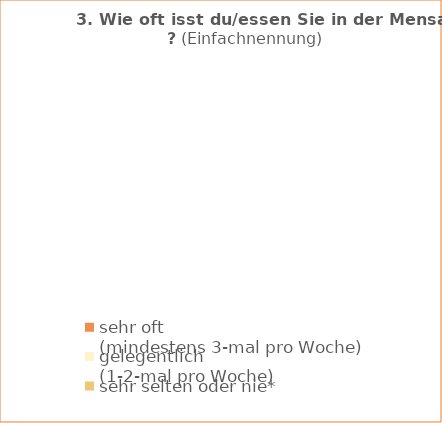
| Category | Series 0 | Series 1 |
|---|---|---|
| sehr oft 
(mindestens 3-mal pro Woche) |  | 0 |
| gelegentlich 
(1-2-mal pro Woche) |  | 0 |
| sehr selten oder nie* |  | 0 |